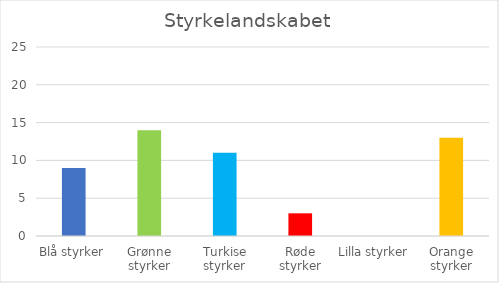
| Category | Series 0 |
|---|---|
| Blå styrker | 9 |
| Grønne styrker | 14 |
| Turkise styrker | 11 |
| Røde styrker | 3 |
| Lilla styrker | 0 |
| Orange styrker | 13 |